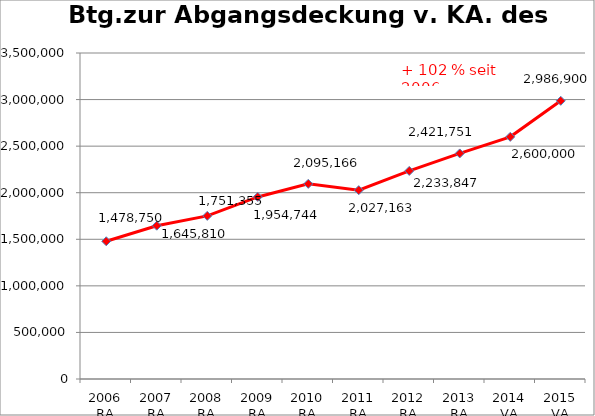
| Category | Btg.zur Abgangsdeckung v. KA. des Landes |
|---|---|
| 2006 RA | 1478750.04 |
| 2007 RA | 1645810.23 |
| 2008 RA | 1751355.49 |
| 2009 RA | 1954744.01 |
| 2010 RA | 2095165.63 |
| 2011 RA | 2027162.68 |
| 2012 RA | 2233846.68 |
| 2013 RA | 2421750.94 |
| 2014 VA | 2600000 |
| 2015 VA | 2986900 |